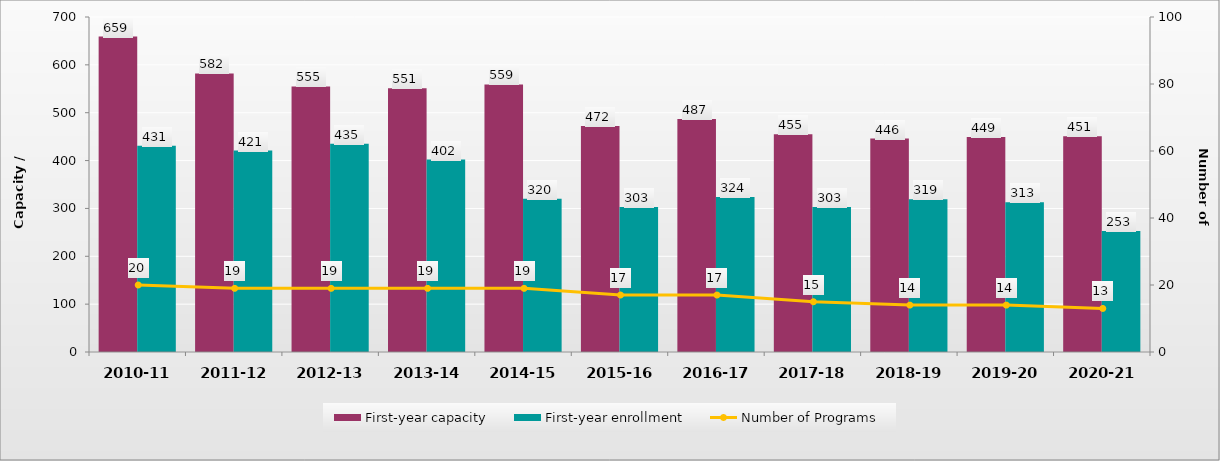
| Category | First-year capacity | First-year enrollment |
|---|---|---|
| 2010-11 | 659 | 431 |
| 2011-12 | 582 | 421 |
| 2012-13 | 555 | 435 |
| 2013-14 | 551 | 402 |
| 2014-15 | 559 | 320 |
| 2015-16 | 472 | 303 |
| 2016-17 | 487 | 324 |
| 2017-18 | 455 | 303 |
| 2018-19 | 446 | 319 |
| 2019-20 | 449 | 313 |
| 2020-21 | 451 | 253 |